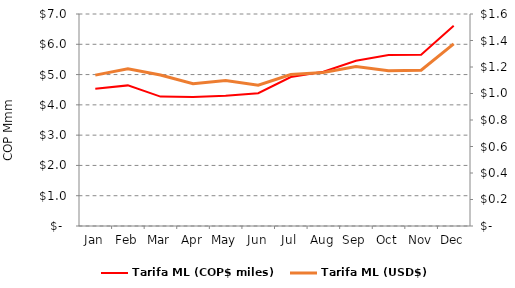
| Category | Tarifa ML (COP$ miles) |
|---|---|
| 2022-01-31 | 4534.635 |
| 2022-02-28 | 4643.036 |
| 2022-03-31 | 4272.345 |
| 2022-04-30 | 4260.261 |
| 2022-05-31 | 4297.769 |
| 2022-06-30 | 4383.552 |
| 2022-07-31 | 4918.336 |
| 2022-08-31 | 5095.364 |
| 2022-09-30 | 5456.498 |
| 2022-10-31 | 5643.695 |
| 2022-11-30 | 5652.389 |
| 2022-12-31 | 6614.879 |